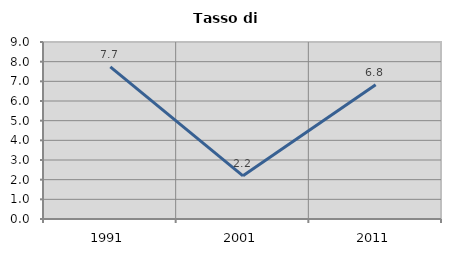
| Category | Tasso di disoccupazione   |
|---|---|
| 1991.0 | 7.737 |
| 2001.0 | 2.196 |
| 2011.0 | 6.83 |